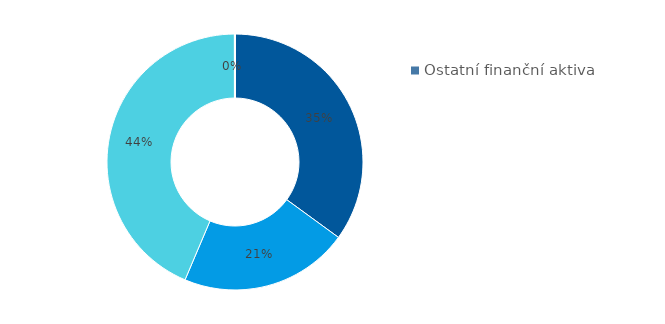
| Category | Series 3 |
|---|---|
| Hotovost | 0.35 |
| Půjčky poskytnuté nemovitostní společnosti | 0.214 |
| Majetkové účasti v nemovitostní společnosti | 0.436 |
| Ostatní finanční aktiva | 0 |